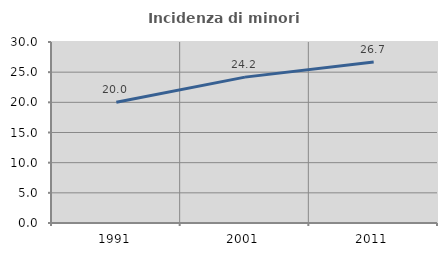
| Category | Incidenza di minori stranieri |
|---|---|
| 1991.0 | 20 |
| 2001.0 | 24.178 |
| 2011.0 | 26.694 |